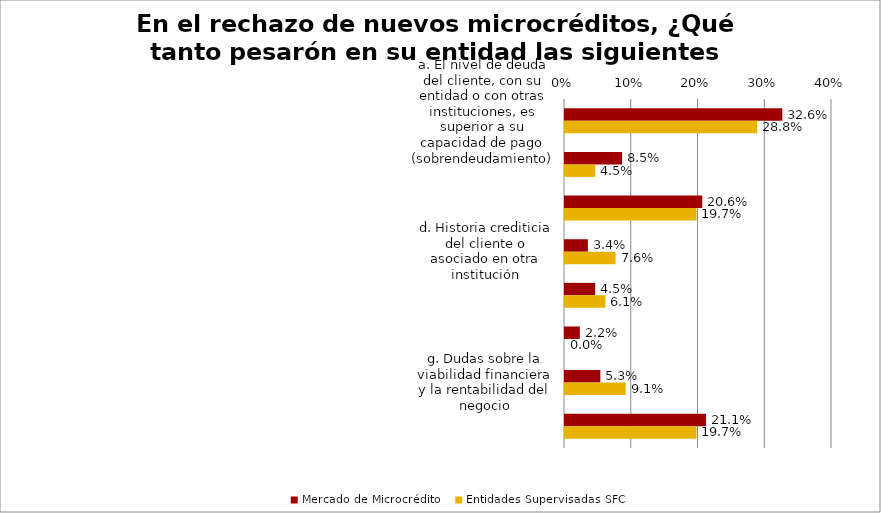
| Category | Mercado de Microcrédito | Entidades Supervisadas SFC |
|---|---|---|
| a. El nivel de deuda del cliente, con su entidad o con otras instituciones, es superior a su capacidad de pago (sobrendeudamiento) | 0.326 | 0.288 |
| b. Crédito con más de tres entidades | 0.085 | 0.045 |
| c. Mala historia crediticia | 0.206 | 0.197 |
| d. Historia crediticia del cliente o asociado en otra institución | 0.034 | 0.076 |
| e. Poco tiempo de creada la microempresa | 0.045 | 0.061 |
| f. Por sector productivo al cual pertenece el aplicante de crédito o del cual deriva sus principales fuentes de ingreso | 0.022 | 0 |
| g. Dudas sobre la viabilidad financiera y la rentabilidad del negocio | 0.053 | 0.091 |
| h. Capacidad de pago del cliente | 0.211 | 0.197 |